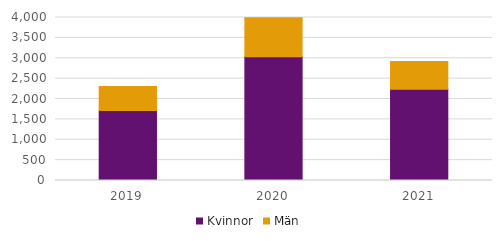
| Category | Kvinnor | Män |
|---|---|---|
| 2019 | 1717 | 588 |
| 2020 | 3034 | 960 |
| 2021 | 2239 | 680 |